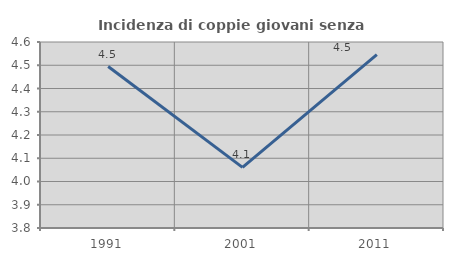
| Category | Incidenza di coppie giovani senza figli |
|---|---|
| 1991.0 | 4.494 |
| 2001.0 | 4.061 |
| 2011.0 | 4.545 |